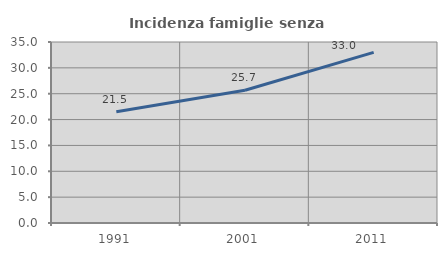
| Category | Incidenza famiglie senza nuclei |
|---|---|
| 1991.0 | 21.504 |
| 2001.0 | 25.672 |
| 2011.0 | 33.003 |